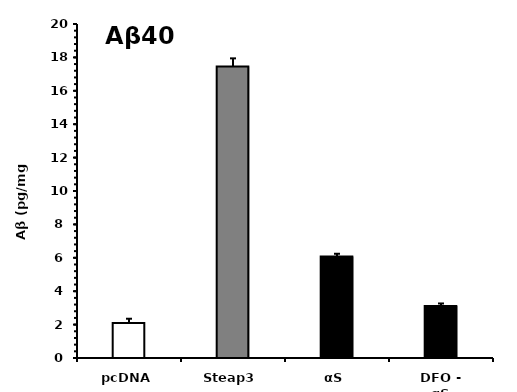
| Category | average |
|---|---|
| pcDNA | 2.093 |
| Steap3 | 17.458 |
| αS | 6.078 |
| DFO - αS | 3.114 |